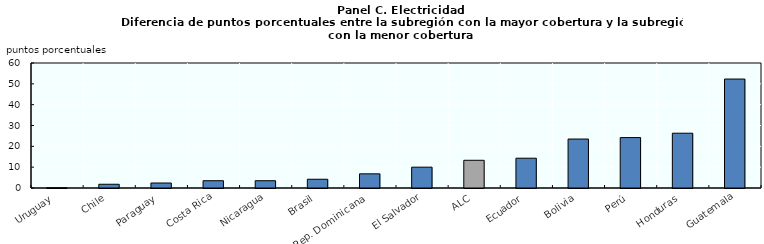
| Category | Uruguay Chile Paraguay Costa Rica Nicaragua Brasil Rep. Dominicana El Salvador ALC Ecuador Bolivia Perú Honduras Guatemala |
|---|---|
| Uruguay | 0.1 |
| Chile | 1.8 |
| Paraguay | 2.4 |
| Costa Rica | 3.5 |
| Nicaragua | 3.5 |
| Brasil | 4.2 |
| Rep. Dominicana | 6.8 |
| El Salvador | 10 |
| ALC | 13.3 |
| Ecuador | 14.3 |
| Bolivia | 23.5 |
| Perú | 24.2 |
| Honduras | 26.3 |
| Guatemala | 52.3 |